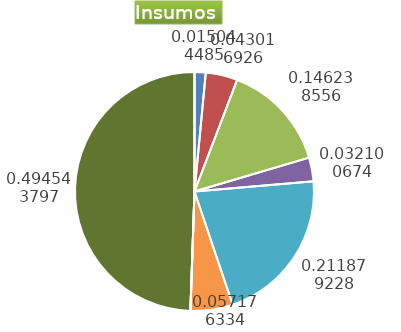
| Category | Series 0 |
|---|---|
| Control arvenses | 33010 |
| Control fitosanitario | 94386 |
| Cosecha y beneficio | 320870.727 |
| Fertilización | 70434 |
| Instalación | 464896.833 |
| Otros | 125454 |
| Podas | 0 |
| Riego | 0 |
| Transporte | 1085108 |
| Tutorado | 0 |